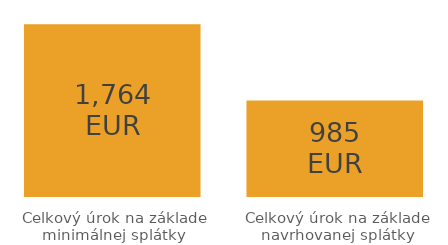
| Category | Series 0 |
|---|---|
| Celkový úrok na základe minimálnej splátky | 1763.952 |
| Celkový úrok na základe navrhovanej splátky | 984.811 |